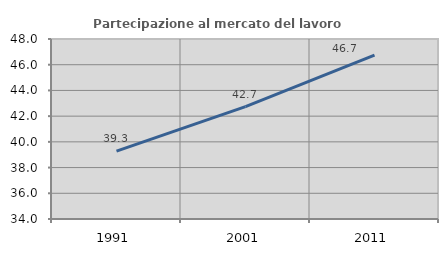
| Category | Partecipazione al mercato del lavoro  femminile |
|---|---|
| 1991.0 | 39.274 |
| 2001.0 | 42.742 |
| 2011.0 | 46.742 |